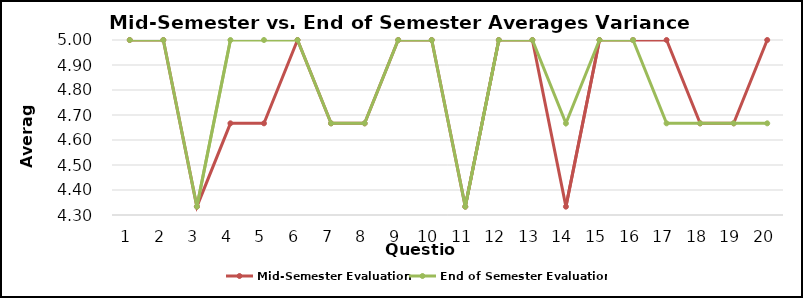
| Category | Mid-Semester Evaluation | End of Semester Evaluation |
|---|---|---|
| 0 | 5 | 5 |
| 1 | 5 | 5 |
| 2 | 4.333 | 4.333 |
| 3 | 4.667 | 5 |
| 4 | 4.667 | 5 |
| 5 | 5 | 5 |
| 6 | 4.667 | 4.667 |
| 7 | 4.667 | 4.667 |
| 8 | 5 | 5 |
| 9 | 5 | 5 |
| 10 | 4.333 | 4.333 |
| 11 | 5 | 5 |
| 12 | 5 | 5 |
| 13 | 4.333 | 4.667 |
| 14 | 5 | 5 |
| 15 | 5 | 5 |
| 16 | 5 | 4.667 |
| 17 | 4.667 | 4.667 |
| 18 | 4.667 | 4.667 |
| 19 | 5 | 4.667 |